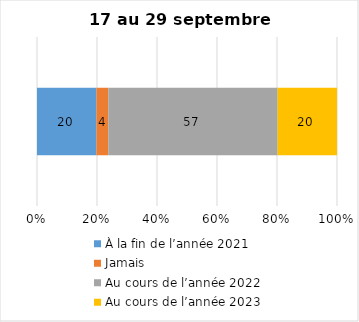
| Category | À la fin de l’année 2021 | Jamais | Au cours de l’année 2022 | Au cours de l’année 2023 |
|---|---|---|---|---|
| 0 | 20 | 4 | 57 | 20 |